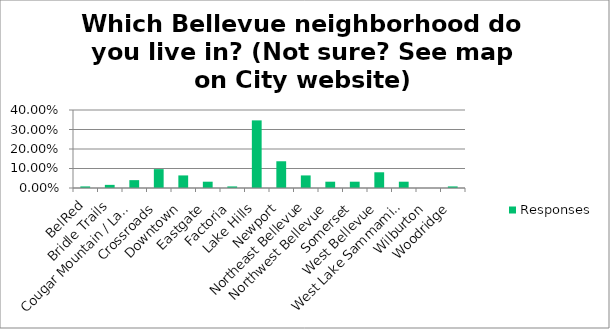
| Category | Responses |
|---|---|
| BelRed | 0.008 |
| Bridle Trails | 0.016 |
| Cougar Mountain / Lakemont | 0.04 |
| Crossroads | 0.097 |
| Downtown | 0.064 |
| Eastgate | 0.032 |
| Factoria | 0.008 |
| Lake Hills | 0.347 |
| Newport | 0.137 |
| Northeast Bellevue | 0.064 |
| Northwest Bellevue | 0.032 |
| Somerset | 0.032 |
| West Bellevue | 0.081 |
| West Lake Sammamish | 0.032 |
| Wilburton | 0 |
| Woodridge | 0.008 |